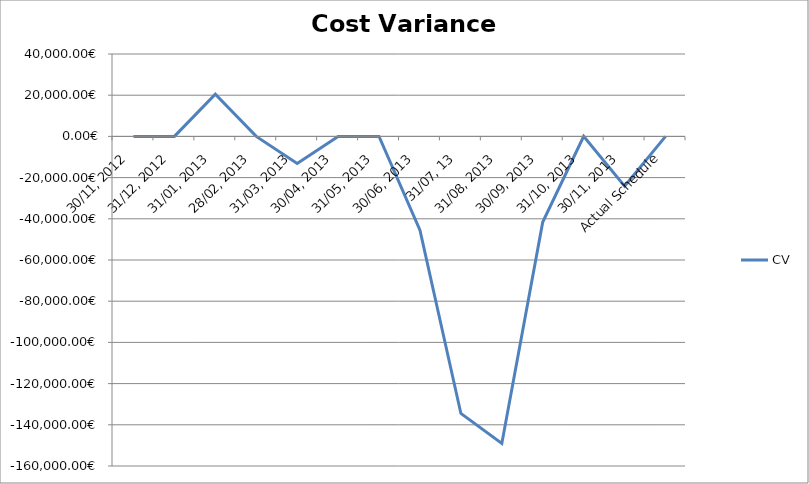
| Category | CV |
|---|---|
| 30/11, 2012 | -9.091 |
| 31/12, 2012 | -2.273 |
| 31/01, 2013 | 20517.944 |
| 28/02, 2013 | 0 |
| 31/03, 2013 | -13105.897 |
| 30/04, 2013 | 0 |
| 31/05, 2013 | 0 |
| 30/06, 2013 | -45497.148 |
| 31/07, 13 | -134504.492 |
| 31/08, 2013 | -149062.614 |
| 30/09, 2013 | -41557.594 |
| 31/10, 2013 | 35.147 |
| 30/11, 2013 | -24152.405 |
| Actual Schedule | 0.001 |